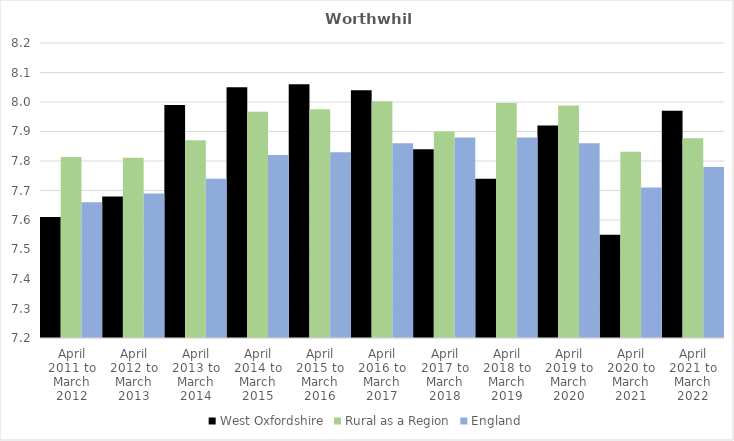
| Category | West Oxfordshire | Rural as a Region | England |
|---|---|---|---|
| April 2011 to March 2012 | 7.61 | 7.813 | 7.66 |
| April 2012 to March 2013 | 7.68 | 7.811 | 7.69 |
| April 2013 to March 2014 | 7.99 | 7.871 | 7.74 |
| April 2014 to March 2015 | 8.05 | 7.967 | 7.82 |
| April 2015 to March 2016 | 8.06 | 7.975 | 7.83 |
| April 2016 to March 2017 | 8.04 | 8.002 | 7.86 |
| April 2017 to March 2018 | 7.84 | 7.9 | 7.88 |
| April 2018 to March 2019 | 7.74 | 7.996 | 7.88 |
| April 2019 to March 2020 | 7.92 | 7.988 | 7.86 |
| April 2020 to March 2021 | 7.55 | 7.831 | 7.71 |
| April 2021 to March 2022 | 7.97 | 7.877 | 7.78 |